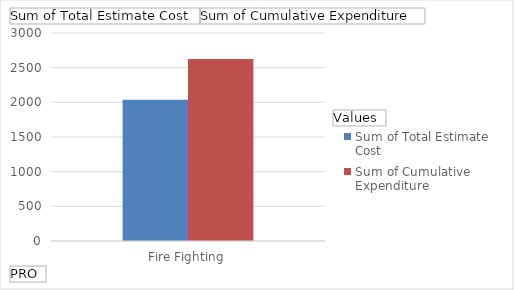
| Category | Sum of Total Estimate Cost | Sum of Cumulative Expenditure  |
|---|---|---|
| Fire Fighting | 2038 | 2626 |